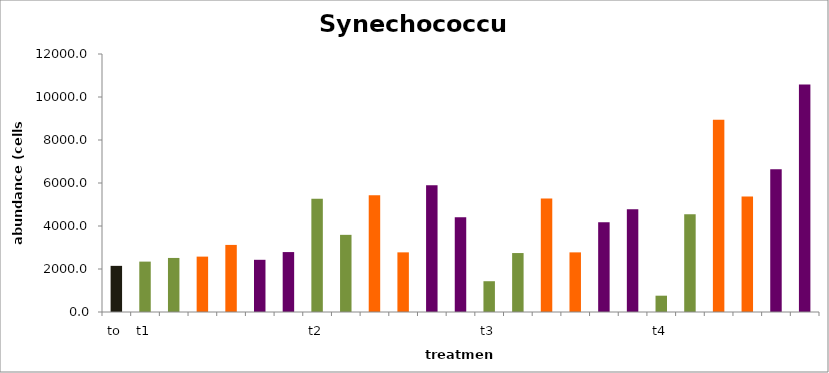
| Category | Series 0 |
|---|---|
| to | 2146.067 |
| t1 | 2343.778 |
|  | 2514.249 |
|  | 2576.127 |
|  | 3120.177 |
|  | 2427.828 |
|  | 2787.126 |
| t2 | 5262.385 |
|  | 3588.71 |
|  | 5430.667 |
|  | 2774.075 |
|  | 5896.637 |
|  | 4412.112 |
| t3 | 1431.701 |
|  | 2741.836 |
|  | 5284.134 |
|  | 2773.53 |
|  | 4170.034 |
|  | 4778.07 |
| t4 | 758.552 |